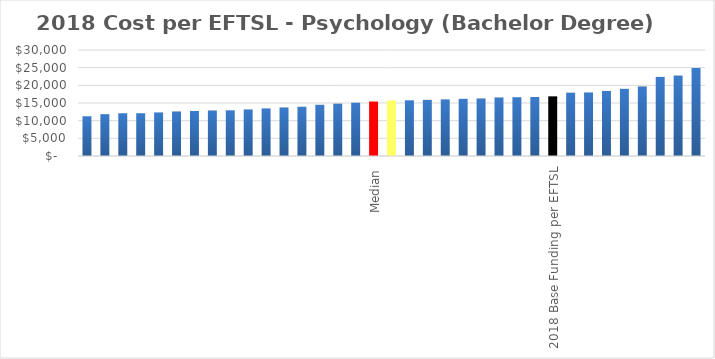
| Category | Series 0 |
|---|---|
|  | 11241.775 |
|  | 11845.416 |
|  | 12096.875 |
|  | 12102.751 |
|  | 12328.6 |
|  | 12588.892 |
|  | 12743.647 |
|  | 12863.722 |
|  | 12930.813 |
|  | 13179.555 |
|  | 13468.003 |
|  | 13723.976 |
|  | 13934.154 |
|  | 14491.48 |
|  | 14806.969 |
|  | 15067.098 |
| Median | 15413.408 |
| Mean  | 15702.762 |
|  | 15759.717 |
|  | 15890.513 |
|  | 16020.098 |
|  | 16175.579 |
|  | 16269.798 |
|  | 16550.875 |
|  | 16637.357 |
|  | 16703.843 |
| 2018 Base Funding per EFTSL | 16882.234 |